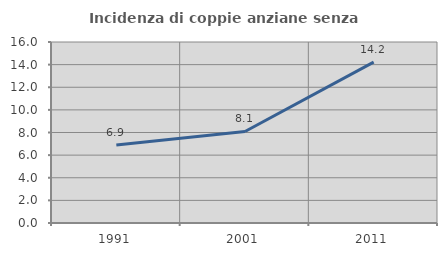
| Category | Incidenza di coppie anziane senza figli  |
|---|---|
| 1991.0 | 6.901 |
| 2001.0 | 8.09 |
| 2011.0 | 14.227 |